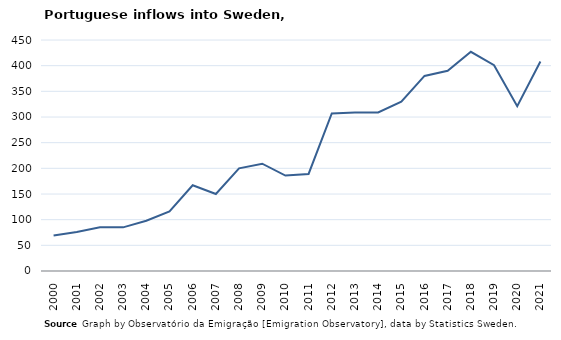
| Category | Entradas |
|---|---|
| 2000.0 | 69 |
| 2001.0 | 76 |
| 2002.0 | 85 |
| 2003.0 | 85 |
| 2004.0 | 98 |
| 2005.0 | 116 |
| 2006.0 | 167 |
| 2007.0 | 150 |
| 2008.0 | 200 |
| 2009.0 | 209 |
| 2010.0 | 186 |
| 2011.0 | 189 |
| 2012.0 | 307 |
| 2013.0 | 309 |
| 2014.0 | 309 |
| 2015.0 | 330 |
| 2016.0 | 380 |
| 2017.0 | 390 |
| 2018.0 | 427 |
| 2019.0 | 401 |
| 2020.0 | 321 |
| 2021.0 | 408 |